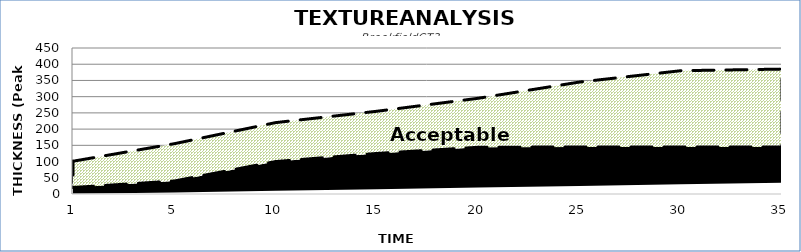
| Category | DAY | MIN | MAX |
|---|---|---|---|
| 1.0 | 1 | 19 | 81 |
| 5.0 | 5 | 35 | 115 |
| 10.0 | 10 | 90 | 120 |
| 15.0 | 15 | 110 | 130 |
| 20.0 | 20 | 124 | 151 |
| 25.0 | 25 | 120 | 200 |
| 30.0 | 30 | 115 | 235 |
| 35.0 | 35 | 110 | 240 |